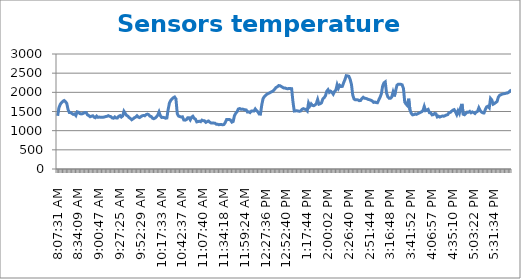
| Category | Sensors temperature (°Cx100) |
|---|---|
| 0.3385532407407407 | 1386 |
| 0.3396412037037037 | 1599 |
| 0.3407291666666667 | 1685 |
| 0.3418171296296297 | 1732 |
| 0.34290509259259255 | 1765 |
| 0.34399305555555554 | 1786 |
| 0.3450810185185185 | 1758 |
| 0.34616898148148145 | 1711 |
| 0.34725694444444444 | 1552 |
| 0.34943287037037035 | 1472 |
| 0.35052083333333334 | 1473 |
| 0.3516087962962963 | 1448 |
| 0.3526967592592593 | 1425 |
| 0.3537847222222222 | 1436 |
| 0.35487268518518517 | 1395 |
| 0.35596064814814815 | 1492 |
| 0.3570486111111111 | 1481 |
| 0.35813657407407407 | 1447 |
| 0.35922453703703705 | 1437 |
| 0.36031250000000004 | 1440 |
| 0.36140046296296297 | 1457 |
| 0.36248842592592595 | 1475 |
| 0.3646643518518518 | 1470 |
| 0.3657523148148148 | 1411 |
| 0.3668402777777778 | 1392 |
| 0.3679282407407407 | 1364 |
| 0.3690162037037037 | 1376 |
| 0.3701041666666667 | 1388 |
| 0.37119212962962966 | 1352 |
| 0.3722800925925926 | 1338 |
| 0.3733680555555556 | 1379 |
| 0.37445601851851856 | 1348 |
| 0.37554398148148144 | 1355 |
| 0.3766319444444444 | 1349 |
| 0.3777199074074074 | 1348 |
| 0.37880787037037034 | 1351 |
| 0.3798958333333333 | 1356 |
| 0.3809837962962963 | 1369 |
| 0.3820717592592593 | 1375 |
| 0.3831597222222222 | 1391 |
| 0.3842476851851852 | 1374 |
| 0.3853356481481482 | 1365 |
| 0.38642361111111106 | 1332 |
| 0.38751157407407405 | 1325 |
| 0.38968749999999996 | 1358 |
| 0.39077546296296295 | 1332 |
| 0.39186342592592593 | 1332 |
| 0.3929513888888889 | 1375 |
| 0.39403935185185185 | 1392 |
| 0.39512731481481483 | 1356 |
| 0.3962152777777778 | 1382 |
| 0.3973032407407407 | 1505 |
| 0.3983912037037037 | 1450 |
| 0.39947916666666666 | 1400 |
| 0.40056712962962965 | 1378 |
| 0.4016550925925926 | 1342 |
| 0.40274305555555556 | 1316 |
| 0.40383101851851855 | 1285 |
| 0.4049189814814815 | 1308 |
| 0.40600694444444446 | 1337 |
| 0.40709490740740745 | 1353 |
| 0.4081828703703703 | 1388 |
| 0.4092708333333333 | 1354 |
| 0.4103587962962963 | 1342 |
| 0.4114467592592593 | 1365 |
| 0.4125347222222222 | 1387 |
| 0.4136226851851852 | 1397 |
| 0.4147106481481482 | 1388 |
| 0.4157986111111111 | 1418 |
| 0.4168865740740741 | 1431 |
| 0.4179745370370371 | 1419 |
| 0.41906249999999995 | 1377 |
| 0.42015046296296293 | 1368 |
| 0.4212384259259259 | 1324 |
| 0.4223263888888889 | 1312 |
| 0.42341435185185183 | 1329 |
| 0.4245023148148148 | 1362 |
| 0.4255902777777778 | 1404 |
| 0.42667824074074073 | 1488 |
| 0.4277662037037037 | 1390 |
| 0.4288541666666667 | 1346 |
| 0.4299421296296296 | 1347 |
| 0.43103009259259256 | 1341 |
| 0.43211805555555555 | 1324 |
| 0.43320601851851853 | 1331 |
| 0.43429398148148146 | 1551 |
| 0.43538194444444445 | 1724 |
| 0.43646990740740743 | 1790 |
| 0.43755787037037036 | 1828 |
| 0.43864583333333335 | 1859 |
| 0.43973379629629633 | 1878 |
| 0.4408217592592592 | 1828 |
| 0.4419097222222222 | 1444 |
| 0.4429976851851852 | 1380 |
| 0.44408564814814816 | 1368 |
| 0.4451736111111111 | 1356 |
| 0.4462615740740741 | 1362 |
| 0.44734953703703706 | 1280 |
| 0.4484375 | 1274 |
| 0.449525462962963 | 1286 |
| 0.4506018518518518 | 1334 |
| 0.4516898148148148 | 1334 |
| 0.4527777777777778 | 1282 |
| 0.4538657407407407 | 1350 |
| 0.4549537037037037 | 1376 |
| 0.4560416666666667 | 1322 |
| 0.45712962962962966 | 1301 |
| 0.4582175925925926 | 1229 |
| 0.4593055555555556 | 1238 |
| 0.46039351851851856 | 1246 |
| 0.46148148148148144 | 1234 |
| 0.4625694444444444 | 1275 |
| 0.4636574074074074 | 1259 |
| 0.46474537037037034 | 1256 |
| 0.4658333333333333 | 1217 |
| 0.4669212962962963 | 1236 |
| 0.4680092592592593 | 1252 |
| 0.4690972222222222 | 1222 |
| 0.4701851851851852 | 1200 |
| 0.4712731481481482 | 1200 |
| 0.47236111111111106 | 1199 |
| 0.47344907407407405 | 1194 |
| 0.47453703703703703 | 1169 |
| 0.47562499999999996 | 1169 |
| 0.47671296296296295 | 1154 |
| 0.47780092592592593 | 1163 |
| 0.4788888888888889 | 1159 |
| 0.47997685185185185 | 1153 |
| 0.4821527777777778 | 1163 |
| 0.4832407407407407 | 1217 |
| 0.4843287037037037 | 1294 |
| 0.48541666666666666 | 1294 |
| 0.4865162037037037 | 1294 |
| 0.48760416666666667 | 1275 |
| 0.4886921296296296 | 1223 |
| 0.4897800925925926 | 1239 |
| 0.49086805555555557 | 1390 |
| 0.4919560185185185 | 1453 |
| 0.4930439814814815 | 1495 |
| 0.49413194444444447 | 1565 |
| 0.4952314814814815 | 1577 |
| 0.4963194444444445 | 1559 |
| 0.49740740740740735 | 1563 |
| 0.49849537037037034 | 1556 |
| 0.4995833333333333 | 1543 |
| 0.5006712962962964 | 1542 |
| 0.5039351851851852 | 1486 |
| 0.5050231481481481 | 1492 |
| 0.5061111111111111 | 1472 |
| 0.507199074074074 | 1510 |
| 0.508287037037037 | 1510 |
| 0.509375 | 1510 |
| 0.510462962962963 | 1566 |
| 0.511550925925926 | 1522 |
| 0.5126388888888889 | 1494 |
| 0.5137268518518519 | 1435 |
| 0.5148148148148148 | 1431 |
| 0.5159027777777777 | 1668 |
| 0.5169907407407407 | 1834 |
| 0.5180787037037037 | 1890 |
| 0.5191666666666667 | 1924 |
| 0.5202546296296297 | 1950 |
| 0.5213425925925926 | 1970 |
| 0.5224305555555556 | 1985 |
| 0.5235185185185185 | 2006 |
| 0.5246064814814815 | 2020 |
| 0.5256944444444445 | 2044 |
| 0.5267824074074073 | 2085 |
| 0.5278703703703703 | 2126 |
| 0.5289583333333333 | 2145 |
| 0.5300462962962963 | 2176 |
| 0.5311342592592593 | 2173 |
| 0.5322222222222223 | 2153 |
| 0.5333101851851852 | 2132 |
| 0.5343981481481481 | 2114 |
| 0.5354861111111111 | 2112 |
| 0.5365740740740741 | 2099 |
| 0.537662037037037 | 2093 |
| 0.53875 | 2102 |
| 0.5398379629629629 | 2100 |
| 0.5409259259259259 | 2095 |
| 0.5420138888888889 | 1756 |
| 0.5431018518518519 | 1512 |
| 0.5441898148148149 | 1516 |
| 0.5452777777777778 | 1518 |
| 0.5463657407407407 | 1513 |
| 0.5474537037037037 | 1504 |
| 0.5485416666666666 | 1515 |
| 0.5496296296296296 | 1559 |
| 0.5507175925925926 | 1574 |
| 0.5518055555555555 | 1560 |
| 0.5528935185185185 | 1553 |
| 0.5539814814814815 | 1516 |
| 0.5572453703703704 | 1719 |
| 0.5605092592592592 | 1643 |
| 0.5615972222222222 | 1699 |
| 0.5626851851851852 | 1659 |
| 0.5659490740740741 | 1652 |
| 0.567037037037037 | 1671 |
| 0.568125 | 1709 |
| 0.569212962962963 | 1813 |
| 0.570300925925926 | 1691 |
| 0.5724768518518518 | 1703 |
| 0.5735648148148148 | 1728 |
| 0.5790046296296296 | 1827 |
| 0.5800925925925926 | 1859 |
| 0.5811805555555556 | 1910 |
| 0.5822685185185185 | 2027 |
| 0.5833564814814814 | 2070 |
| 0.5844444444444444 | 2000 |
| 0.5855324074074074 | 2028 |
| 0.5866203703703704 | 2000 |
| 0.5877083333333334 | 1952 |
| 0.5887962962962963 | 2024 |
| 0.5898842592592592 | 2058 |
| 0.5909722222222222 | 2199 |
| 0.5931481481481481 | 2110 |
| 0.5942361111111111 | 2182 |
| 0.5953240740740741 | 2151 |
| 0.596412037037037 | 2155 |
| 0.5975 | 2251 |
| 0.598587962962963 | 2333 |
| 0.599675925925926 | 2434 |
| 0.6007638888888889 | 2429 |
| 0.6018518518518519 | 2417 |
| 0.6029398148148148 | 2339 |
| 0.6040277777777777 | 2206 |
| 0.6051157407407407 | 1928 |
| 0.6062037037037037 | 1827 |
| 0.6072916666666667 | 1805 |
| 0.6083796296296297 | 1806 |
| 0.6094675925925926 | 1802 |
| 0.6105555555555556 | 1783 |
| 0.6116435185185185 | 1787 |
| 0.6127314814814815 | 1838 |
| 0.6138194444444445 | 1872 |
| 0.6149074074074073 | 1847 |
| 0.6159953703703703 | 1842 |
| 0.6170833333333333 | 1832 |
| 0.6181712962962963 | 1813 |
| 0.6192592592592593 | 1807 |
| 0.6203472222222223 | 1792 |
| 0.6214351851851853 | 1777 |
| 0.6225231481481481 | 1738 |
| 0.6236111111111111 | 1747 |
| 0.6246990740740741 | 1732 |
| 0.625787037037037 | 1730 |
| 0.626875 | 1800 |
| 0.627962962962963 | 1870 |
| 0.6290509259259259 | 1962 |
| 0.6301388888888889 | 2164 |
| 0.6312268518518519 | 2247 |
| 0.6323148148148149 | 2273 |
| 0.6334027777777778 | 1980 |
| 0.6344907407407407 | 1883 |
| 0.6355787037037037 | 1845 |
| 0.6366666666666666 | 1847 |
| 0.6377546296296296 | 1880 |
| 0.6388425925925926 | 2004 |
| 0.6399305555555556 | 1894 |
| 0.6410185185185185 | 2045 |
| 0.6421064814814815 | 2183 |
| 0.6431944444444445 | 2213 |
| 0.6442824074074074 | 2213 |
| 0.6453703703703704 | 2210 |
| 0.6464583333333334 | 2196 |
| 0.6475462962962962 | 2100 |
| 0.6486342592592592 | 1746 |
| 0.6497222222222222 | 1694 |
| 0.6508101851851852 | 1656 |
| 0.6518981481481482 | 1833 |
| 0.6529861111111112 | 1542 |
| 0.6540740740740741 | 1453 |
| 0.655162037037037 | 1413 |
| 0.65625 | 1419 |
| 0.657337962962963 | 1436 |
| 0.6584259259259259 | 1425 |
| 0.6595138888888888 | 1444 |
| 0.6606018518518518 | 1458 |
| 0.6616898148148148 | 1477 |
| 0.6627777777777778 | 1493 |
| 0.6638657407407408 | 1524 |
| 0.6649537037037038 | 1632 |
| 0.6660416666666666 | 1523 |
| 0.6671296296296297 | 1537 |
| 0.6682291666666668 | 1555 |
| 0.6693171296296296 | 1469 |
| 0.6704050925925925 | 1465 |
| 0.6714930555555556 | 1411 |
| 0.6725810185185185 | 1419 |
| 0.6736805555555555 | 1449 |
| 0.6747685185185185 | 1441 |
| 0.6769444444444445 | 1359 |
| 0.6780324074074073 | 1379 |
| 0.6791203703703704 | 1356 |
| 0.6802083333333333 | 1370 |
| 0.6812962962962964 | 1383 |
| 0.6823842592592593 | 1377 |
| 0.6834722222222221 | 1390 |
| 0.6845601851851852 | 1409 |
| 0.6856481481481481 | 1417 |
| 0.6878240740740741 | 1466 |
| 0.6889120370370371 | 1476 |
| 0.69 | 1506 |
| 0.691087962962963 | 1534 |
| 0.6921759259259259 | 1549 |
| 0.6943518518518519 | 1492 |
| 0.6954398148148148 | 1420 |
| 0.6965277777777777 | 1518 |
| 0.6976157407407407 | 1451 |
| 0.6987037037037037 | 1600 |
| 0.6997916666666667 | 1698 |
| 0.7008796296296297 | 1429 |
| 0.7019675925925926 | 1415 |
| 0.7030555555555557 | 1451 |
| 0.7041435185185185 | 1485 |
| 0.7052314814814814 | 1480 |
| 0.7074074074074074 | 1503 |
| 0.7084953703703704 | 1467 |
| 0.7095833333333333 | 1488 |
| 0.7106712962962963 | 1473 |
| 0.7117592592592592 | 1449 |
| 0.7128472222222223 | 1485 |
| 0.7139351851851852 | 1504 |
| 0.715023148148148 | 1597 |
| 0.7161111111111111 | 1526 |
| 0.717199074074074 | 1487 |
| 0.718287037037037 | 1465 |
| 0.719375 | 1462 |
| 0.720462962962963 | 1552 |
| 0.721550925925926 | 1622 |
| 0.7226388888888889 | 1638 |
| 0.7237268518518518 | 1598 |
| 0.7269907407407407 | 1841 |
| 0.7280787037037038 | 1799 |
| 0.7291666666666666 | 1690 |
| 0.7302546296296296 | 1709 |
| 0.7313425925925926 | 1734 |
| 0.7324305555555556 | 1760 |
| 0.7335185185185185 | 1874 |
| 0.7346064814814816 | 1923 |
| 0.7356944444444444 | 1938 |
| 0.7367824074074073 | 1954 |
| 0.7378703703703704 | 1962 |
| 0.7389583333333333 | 1968 |
| 0.7400462962962964 | 1979 |
| 0.7411342592592592 | 1984 |
| 0.7422222222222222 | 2002 |
| 0.7433101851851852 | 2039 |
| 0.7443981481481482 | 2057 |